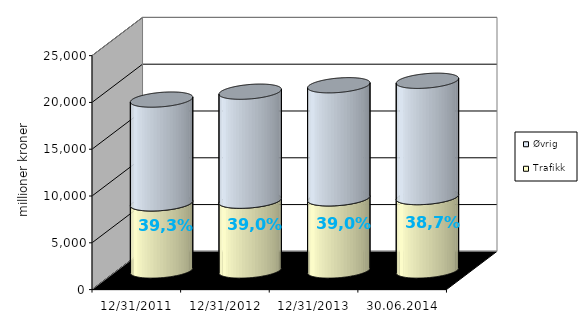
| Category | Trafikk | Øvrig |
|---|---|---|
| 31.12.2011 | 7171.76 | 11089.078 |
| 31.12.2012 | 7457.552 | 11647.433 |
| 31.12.2013 | 7709.892 | 12083.527 |
| 30.06.2014 | 7846.118 | 12424.174 |